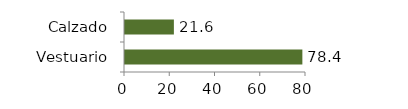
| Category | Vestuario y calzado |
|---|---|
| Vestuario | 78.393 |
| Calzado | 21.607 |